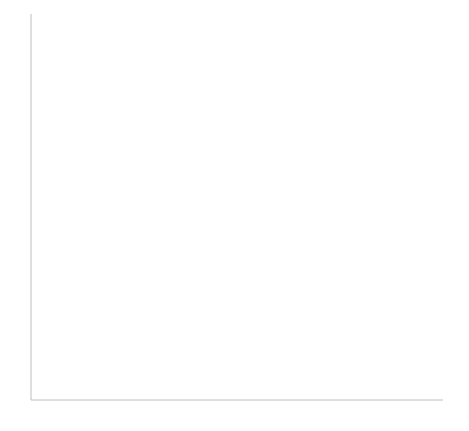
| Category | Y |
|---|---|
| -1.0 | -1 |
| -1.0 | -1 |
| -1.0 | -1 |
| -1.0 | -1 |
| -1.0 | -1 |
| -1.0 | -1 |
| -1.0 | -1 |
| -1.0 | -1 |
| -1.0 | -1 |
| -1.0 | -1 |
| -1.0 | -1 |
| -1.0 | -1 |
| -1.0 | -1 |
| -1.0 | -1 |
| -1.0 | -1 |
| -1.0 | -1 |
| -1.0 | -1 |
| -1.0 | -1 |
| -1.0 | -1 |
| -1.0 | -1 |
| -1.0 | -1 |
| -1.0 | -1 |
| -1.0 | -1 |
| -1.0 | -1 |
| -1.0 | -1 |
| -1.0 | -1 |
| -1.0 | -1 |
| -1.0 | -1 |
| -1.0 | -1 |
| -1.0 | -1 |
| -1.0 | -1 |
| -1.0 | -1 |
| -1.0 | -1 |
| -1.0 | -1 |
| -1.0 | -1 |
| -1.0 | -1 |
| -1.0 | -1 |
| -1.0 | -1 |
| -1.0 | -1 |
| -1.0 | -1 |
| -1.0 | -1 |
| -1.0 | -1 |
| -1.0 | -1 |
| -1.0 | -1 |
| -1.0 | -1 |
| -1.0 | -1 |
| -1.0 | -1 |
| -1.0 | -1 |
| -1.0 | -1 |
| -1.0 | -1 |